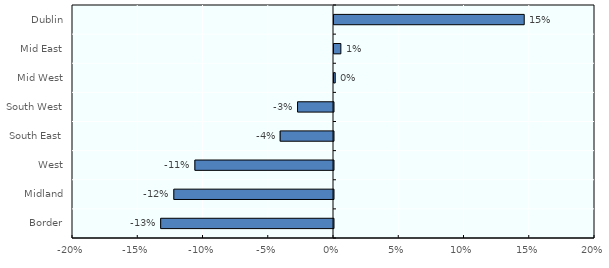
| Category | Series 0 |
|---|---|
| Border | -0.132 |
| Midland | -0.122 |
| West | -0.106 |
| South East | -0.041 |
| South West | -0.028 |
| Mid West | 0.001 |
| Mid East | 0.005 |
| Dublin | 0.146 |